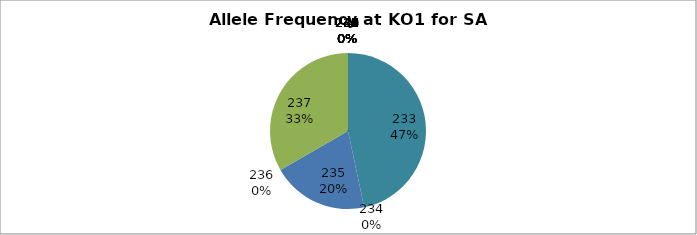
| Category | Series 0 |
|---|---|
| 221.0 | 0 |
| 227.0 | 0 |
| 231.0 | 0 |
| 232.0 | 0 |
| 233.0 | 0.467 |
| 234.0 | 0 |
| 235.0 | 0.2 |
| 236.0 | 0 |
| 237.0 | 0.333 |
| 238.0 | 0 |
| 239.0 | 0 |
| 240.0 | 0 |
| 241.0 | 0 |
| 242.0 | 0 |
| 243.0 | 0 |
| 244.0 | 0 |
| 245.0 | 0 |
| 247.0 | 0 |
| 249.0 | 0 |